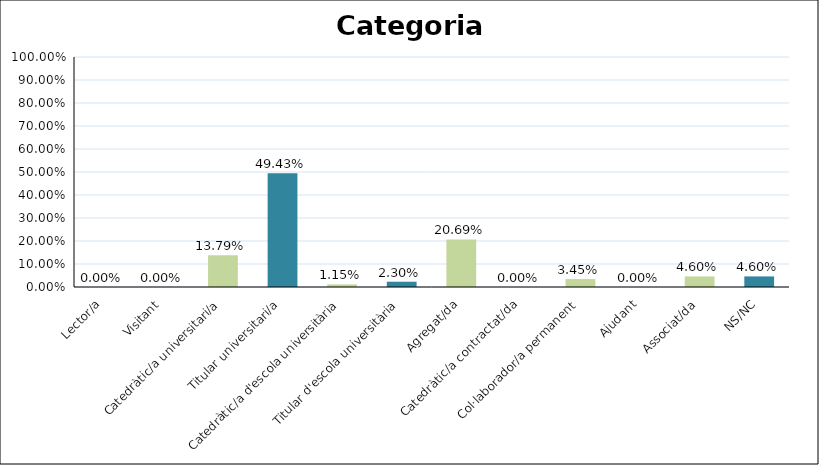
| Category | Series 0 |
|---|---|
| Lector/a | 0 |
| Visitant | 0 |
| Catedràtic/a universitari/a | 0.138 |
| Titular universitari/a | 0.494 |
| Catedràtic/a d'escola universitària | 0.011 |
| Titular d'escola universitària | 0.023 |
| Agregat/da | 0.207 |
| Catedràtic/a contractat/da | 0 |
| Col·laborador/a permanent | 0.034 |
| Ajudant | 0 |
| Associat/da | 0.046 |
| NS/NC | 0.046 |